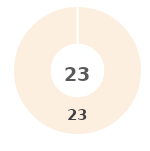
| Category | Series 0 |
|---|---|
| 0 | 0 |
| 1 | 0 |
| 2 | 0 |
| 3 | 0 |
| 4 | 23 |